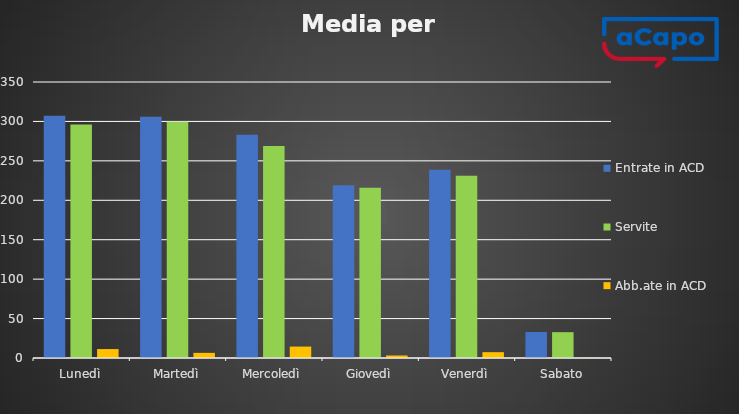
| Category | Entrate in ACD | Servite | Abb.ate in ACD |
|---|---|---|---|
| Lunedì | 307.333 | 296 | 11.333 |
| Martedì | 306 | 299.5 | 6.5 |
| Mercoledì | 283.25 | 268.75 | 14.5 |
| Giovedì | 219.2 | 216 | 3.2 |
| Venerdì | 238.6 | 231.2 | 7.4 |
| Sabato | 33 | 32.75 | 0.25 |